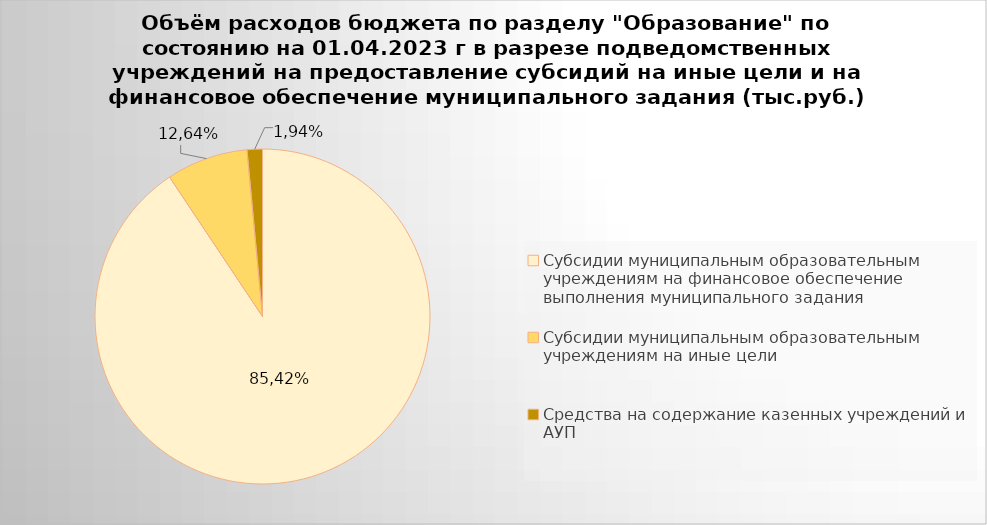
| Category | Series 0 |
|---|---|
| Субсидии муниципальным образовательным учреждениям на финансовое обеспечение выполнения муниципального задания | 7956070.54 |
| Субсидии муниципальным образовательным учреждениям на иные цели | 691696.08 |
| Средства на содержание казенных учреждений и АУП | 129747.54 |